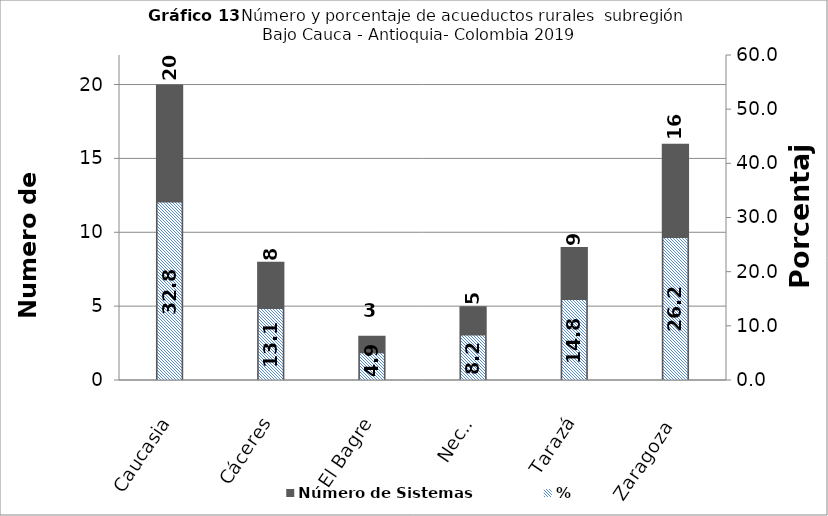
| Category | Número de Sistemas |
|---|---|
| Caucasia | 20 |
| Cáceres | 8 |
| El Bagre | 3 |
| Nechi | 5 |
| Tarazá | 9 |
| Zaragoza | 16 |